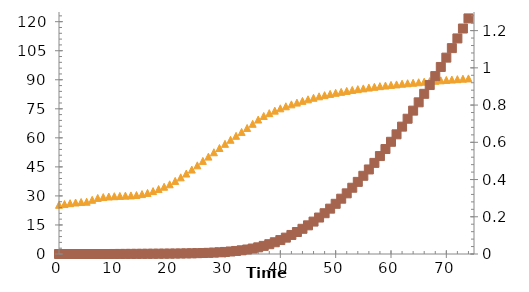
| Category | Series 0 |
|---|---|
| 0.0 | 25.4 |
| 1.0 | 25.8 |
| 2.0 | 26.25 |
| 3.0 | 26.6 |
| 4.0 | 26.85 |
| 5.0 | 27 |
| 6.0 | 28 |
| 7.0 | 28.95 |
| 8.0 | 29.4 |
| 9.0 | 29.7 |
| 10.0 | 29.85 |
| 11.0 | 30 |
| 12.0 | 30.15 |
| 13.0 | 30.25 |
| 14.0 | 30.45 |
| 15.0 | 30.95 |
| 16.0 | 31.55 |
| 17.0 | 32.5 |
| 18.0 | 33.55 |
| 19.0 | 34.75 |
| 20.0 | 36 |
| 21.0 | 37.75 |
| 22.0 | 39.6 |
| 23.0 | 41.55 |
| 24.0 | 43.6 |
| 25.0 | 45.8 |
| 26.0 | 48.1 |
| 27.0 | 50.3 |
| 28.0 | 52.55 |
| 29.0 | 54.75 |
| 30.0 | 56.9 |
| 31.0 | 59 |
| 32.0 | 61.05 |
| 33.0 | 63.05 |
| 34.0 | 65.1 |
| 35.0 | 67.25 |
| 36.0 | 69.45 |
| 37.0 | 71.3 |
| 38.0 | 72.75 |
| 39.0 | 74.05 |
| 40.0 | 75.25 |
| 41.0 | 76.3 |
| 42.0 | 77.3 |
| 43.0 | 78.2 |
| 44.0 | 79.1 |
| 45.0 | 79.9 |
| 46.0 | 80.7 |
| 47.0 | 81.45 |
| 48.0 | 82.05 |
| 49.0 | 82.7 |
| 50.0 | 83.25 |
| 51.0 | 83.75 |
| 52.0 | 84.25 |
| 53.0 | 84.75 |
| 54.0 | 85.15 |
| 55.0 | 85.55 |
| 56.0 | 85.95 |
| 57.0 | 86.35 |
| 58.0 | 86.7 |
| 59.0 | 87 |
| 60.0 | 87.35 |
| 61.0 | 87.6 |
| 62.0 | 87.95 |
| 63.0 | 88.2 |
| 64.0 | 88.45 |
| 65.0 | 88.7 |
| 66.0 | 89 |
| 67.0 | 89.3 |
| 68.0 | 89.45 |
| 69.0 | 89.7 |
| 70.0 | 89.9 |
| 71.0 | 90.1 |
| 72.0 | 90.3 |
| 73.0 | 90.55 |
| 74.0 | 90.7 |